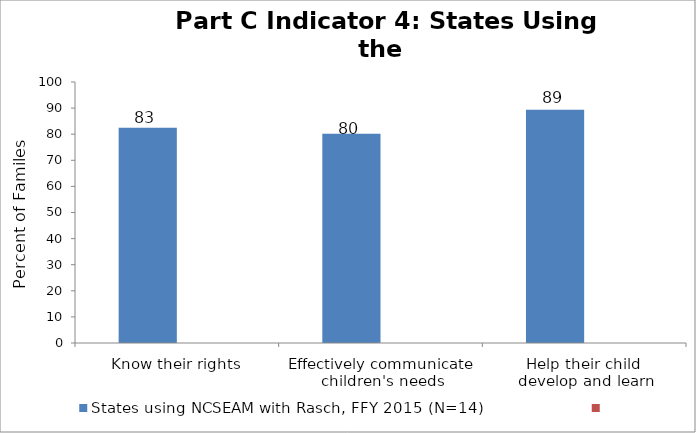
| Category | States using NCSEAM with Rasch, FFY 2015 (N=14) | Series 1 |
|---|---|---|
| Know their rights | 82.5 |  |
| Effectively communicate 
children's needs | 80.2 |  |
| Help their child 
develop and learn | 89.4 |  |